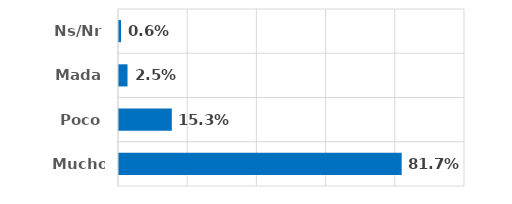
| Category | Series 0 |
|---|---|
| Mucho | 0.817 |
| Poco | 0.153 |
| Mada | 0.025 |
| Ns/Nr | 0.006 |